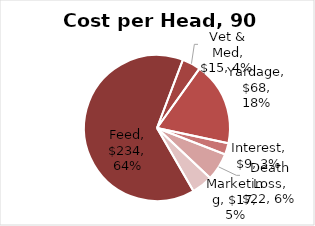
| Category | Cost per Head, 90 days |
|---|---|
| Feed | 234 |
| Vet & Med | 15 |
| Yardage | 67.5 |
| Interest | 9.201 |
| Death Loss | 22.333 |
| Marketing | 17 |